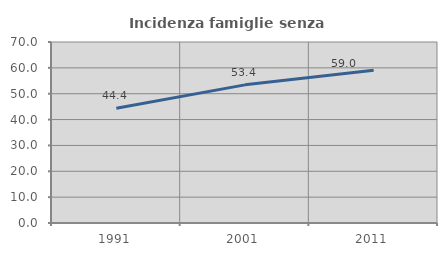
| Category | Incidenza famiglie senza nuclei |
|---|---|
| 1991.0 | 44.364 |
| 2001.0 | 53.425 |
| 2011.0 | 59.044 |